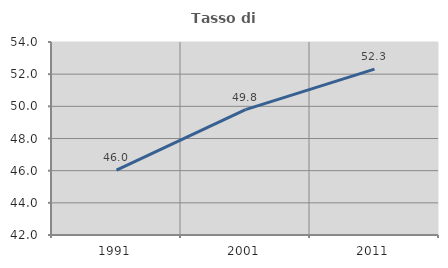
| Category | Tasso di occupazione   |
|---|---|
| 1991.0 | 46.039 |
| 2001.0 | 49.794 |
| 2011.0 | 52.315 |